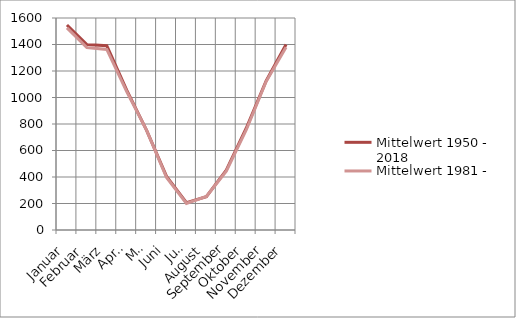
| Category | Mittelwert 1950 - 2018 | Mittelwert 1981 - 2010 |
|---|---|---|
| Januar | 1547.421 | 1525.643 |
| Februar | 1399.259 | 1377.28 |
| März | 1390.38 | 1362.67 |
| April | 1054.877 | 1045.15 |
| Mai | 751.675 | 752.45 |
| Juni | 404.083 | 396.247 |
| Juli | 206.584 | 200.823 |
| August | 251.039 | 252.897 |
| September | 452.341 | 443.677 |
| Oktober | 767.839 | 754.71 |
| November | 1124.713 | 1120.353 |
| Dezember | 1399.439 | 1379.673 |